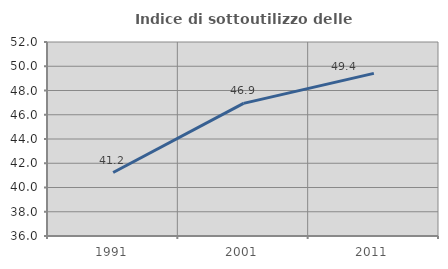
| Category | Indice di sottoutilizzo delle abitazioni  |
|---|---|
| 1991.0 | 41.237 |
| 2001.0 | 46.939 |
| 2011.0 | 49.412 |